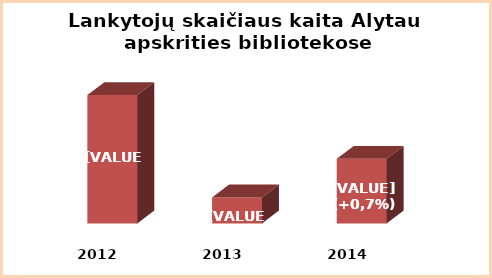
| Category | Series 0 |
|---|---|
| 2012.0 | 778916 |
| 2013.0 | 763820 |
| 2014.0 | 769520 |